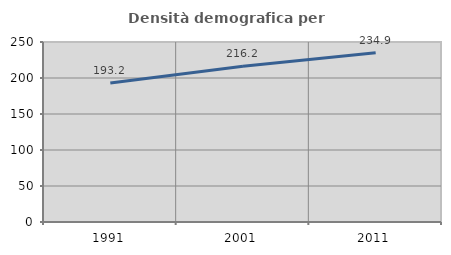
| Category | Densità demografica |
|---|---|
| 1991.0 | 193.158 |
| 2001.0 | 216.177 |
| 2011.0 | 234.907 |